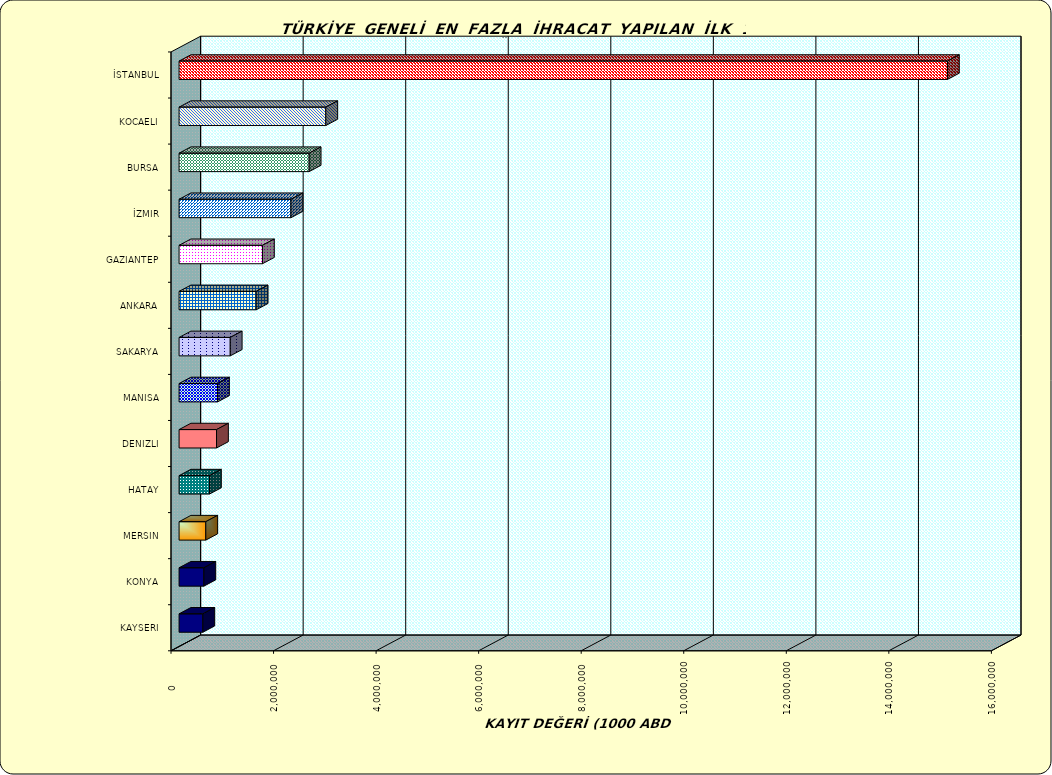
| Category | Series 0 |
|---|---|
| İSTANBUL | 14985333.784 |
| KOCAELI | 2861535.761 |
| BURSA | 2537456.518 |
| İZMIR | 2182766.159 |
| GAZIANTEP | 1626563.184 |
| ANKARA | 1503665.123 |
| SAKARYA | 998208.214 |
| MANISA | 749928.666 |
| DENIZLI | 730246.516 |
| HATAY | 592968.742 |
| MERSIN | 521074.157 |
| KONYA | 483407.968 |
| KAYSERI | 463677.054 |